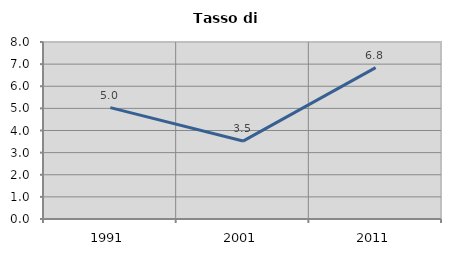
| Category | Tasso di disoccupazione   |
|---|---|
| 1991.0 | 5.032 |
| 2001.0 | 3.522 |
| 2011.0 | 6.84 |